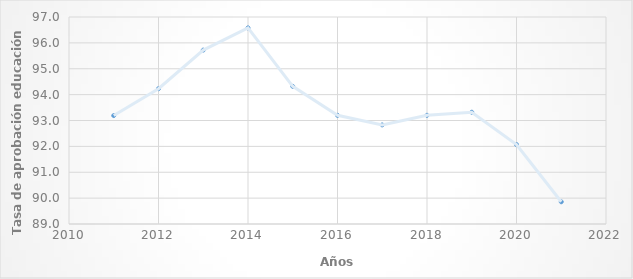
| Category | Series 0 |
|---|---|
| 2011.0 | 93.19 |
| 2012.0 | 94.23 |
| 2013.0 | 95.72 |
| 2014.0 | 96.58 |
| 2015.0 | 94.32 |
| 2016.0 | 93.2 |
| 2017.0 | 92.83 |
| 2018.0 | 93.2 |
| 2019.0 | 93.32 |
| 2020.0 | 92.07 |
| 2021.0 | 89.859 |